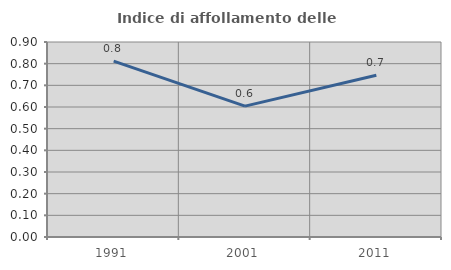
| Category | Indice di affollamento delle abitazioni  |
|---|---|
| 1991.0 | 0.812 |
| 2001.0 | 0.604 |
| 2011.0 | 0.746 |